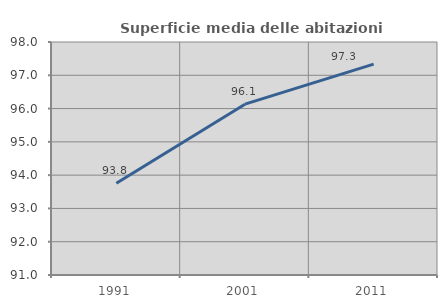
| Category | Superficie media delle abitazioni occupate |
|---|---|
| 1991.0 | 93.754 |
| 2001.0 | 96.132 |
| 2011.0 | 97.336 |